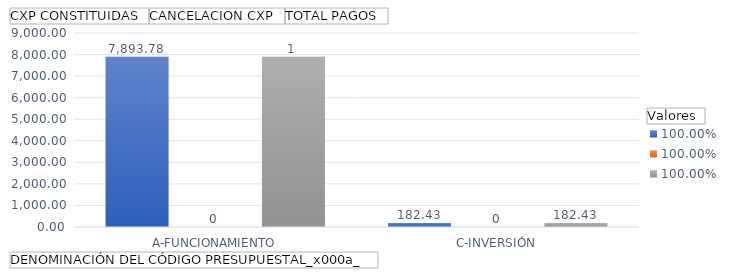
| Category | CXP CONSTITUIDAS | CANCELACION CXP | TOTAL PAGOS |
|---|---|---|---|
| A-FUNCIONAMIENTO | 7893.785 | 0 | 7893.785 |
| C-INVERSIÓN | 182.429 | 0 | 182.429 |